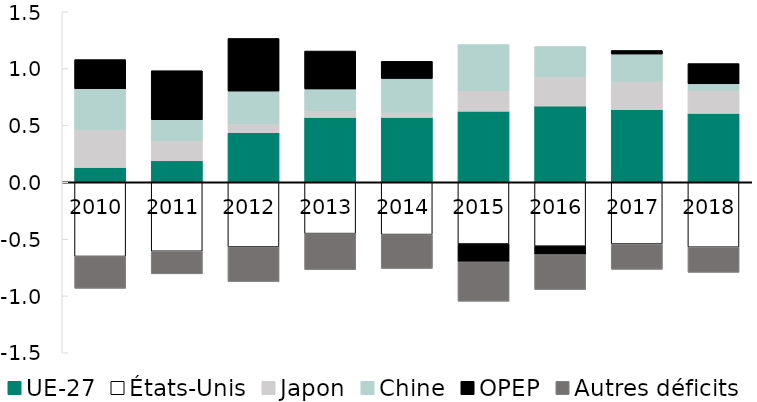
| Category | UE-27 | États-Unis | Japon | Chine | OPEP | Autres déficits |
|---|---|---|---|---|---|---|
| 2010.0 | 0.129 | -0.653 | 0.334 | 0.36 | 0.256 | -0.28 |
| 2011.0 | 0.189 | -0.607 | 0.177 | 0.185 | 0.431 | -0.199 |
| 2012.0 | 0.436 | -0.568 | 0.08 | 0.287 | 0.463 | -0.305 |
| 2013.0 | 0.569 | -0.452 | 0.06 | 0.192 | 0.333 | -0.317 |
| 2014.0 | 0.57 | -0.46 | 0.046 | 0.298 | 0.15 | -0.298 |
| 2015.0 | 0.624 | -0.543 | 0.182 | 0.405 | -0.157 | -0.346 |
| 2016.0 | 0.67 | -0.562 | 0.259 | 0.265 | -0.073 | -0.307 |
| 2017.0 | 0.638 | -0.543 | 0.249 | 0.241 | 0.031 | -0.223 |
| 2018.0 | 0.606 | -0.571 | 0.203 | 0.057 | 0.178 | -0.221 |